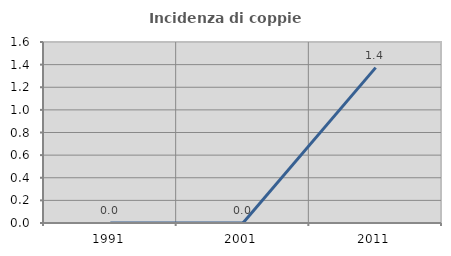
| Category | Incidenza di coppie miste |
|---|---|
| 1991.0 | 0 |
| 2001.0 | 0 |
| 2011.0 | 1.374 |